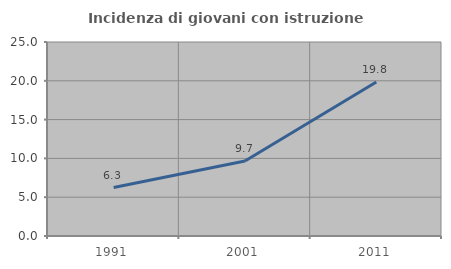
| Category | Incidenza di giovani con istruzione universitaria |
|---|---|
| 1991.0 | 6.25 |
| 2001.0 | 9.674 |
| 2011.0 | 19.849 |